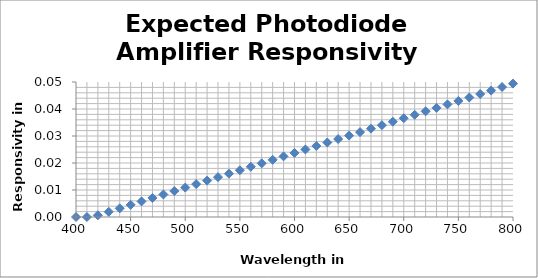
| Category | Series 0 |
|---|---|
| 400.0 | 0 |
| 410.0 | 0 |
| 420.0 | 0.001 |
| 430.0 | 0.002 |
| 440.0 | 0.003 |
| 450.0 | 0.004 |
| 460.0 | 0.006 |
| 470.0 | 0.007 |
| 480.0 | 0.008 |
| 490.0 | 0.01 |
| 500.0 | 0.011 |
| 510.0 | 0.012 |
| 520.0 | 0.013 |
| 530.0 | 0.015 |
| 540.0 | 0.016 |
| 550.0 | 0.017 |
| 560.0 | 0.019 |
| 570.0 | 0.02 |
| 580.0 | 0.021 |
| 590.0 | 0.022 |
| 600.0 | 0.024 |
| 610.0 | 0.025 |
| 620.0 | 0.026 |
| 630.0 | 0.028 |
| 640.0 | 0.029 |
| 650.0 | 0.03 |
| 660.0 | 0.031 |
| 670.0 | 0.033 |
| 680.0 | 0.034 |
| 690.0 | 0.035 |
| 700.0 | 0.037 |
| 710.0 | 0.038 |
| 720.0 | 0.039 |
| 730.0 | 0.04 |
| 740.0 | 0.042 |
| 750.0 | 0.043 |
| 760.0 | 0.044 |
| 770.0 | 0.046 |
| 780.0 | 0.047 |
| 790.0 | 0.048 |
| 800.0 | 0.049 |